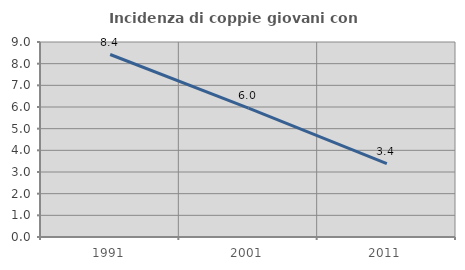
| Category | Incidenza di coppie giovani con figli |
|---|---|
| 1991.0 | 8.423 |
| 2001.0 | 5.95 |
| 2011.0 | 3.382 |